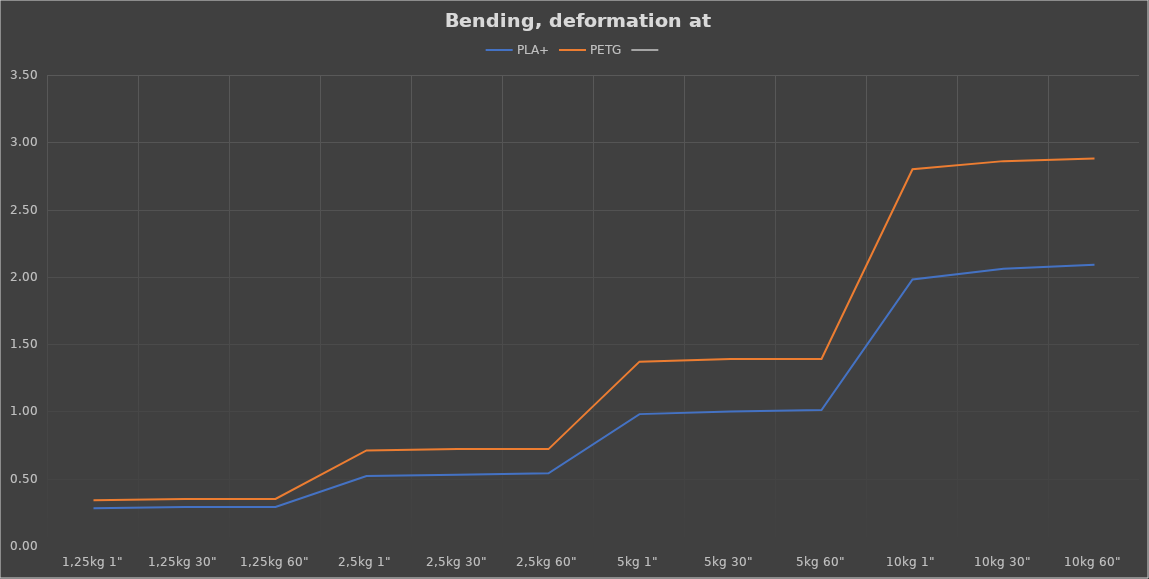
| Category | PLA+ | PETG | Series 2 |
|---|---|---|---|
| 1,25kg 1" | 0.28 | 0.34 |  |
| 1,25kg 30" | 0.29 | 0.35 |  |
| 1,25kg 60" | 0.29 | 0.35 |  |
| 2,5kg 1" | 0.52 | 0.71 |  |
| 2,5kg 30" | 0.53 | 0.72 |  |
| 2,5kg 60" | 0.54 | 0.72 |  |
| 5kg 1" | 0.98 | 1.37 |  |
| 5kg 30" | 1 | 1.39 |  |
| 5kg 60" | 1.01 | 1.39 |  |
| 10kg 1" | 1.98 | 2.8 |  |
| 10kg 30" | 2.06 | 2.86 |  |
| 10kg 60" | 2.09 | 2.88 |  |